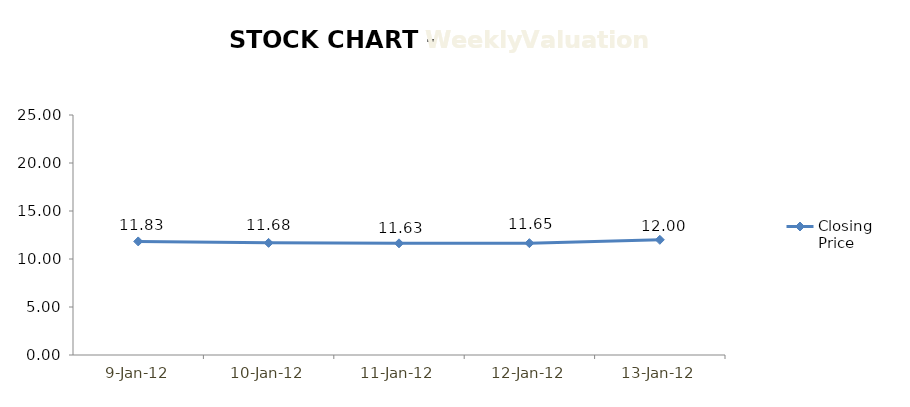
| Category | Closing Price |
|---|---|
| 2012-01-09 | 11.83 |
| 2012-01-10 | 11.68 |
| 2012-01-11 | 11.63 |
| 2012-01-12 | 11.65 |
| 2012-01-13 | 12 |